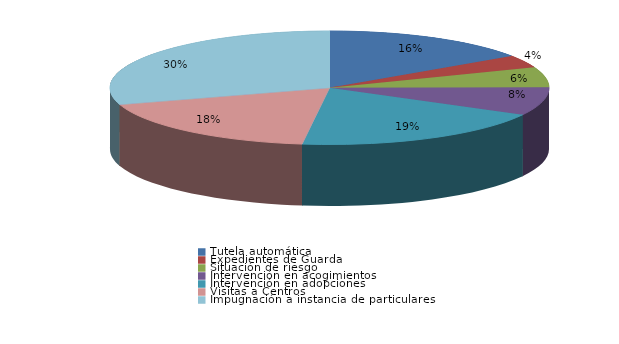
| Category | Series 0 |
|---|---|
| Tutela automática | 35 |
| Expedientes de Guarda | 8 |
| Situación de riesgo | 13 |
| Intervención en acogimientos | 18 |
| Intervención en adopciones | 43 |
| Defensa de los derechos fundamentales | 0 |
| Sustracción internacional de menores | 0 |
| Visitas a Centros | 41 |
| Ensayos Clínicos | 0 |
| Impugnación a instacia del Fiscal | 0 |
| Impugnación a instancia de particulares | 67 |